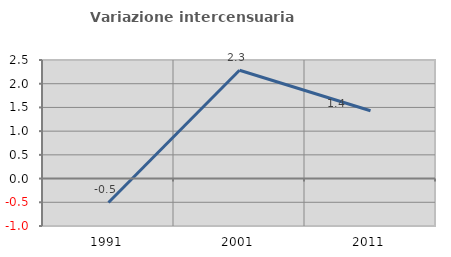
| Category | Variazione intercensuaria annua |
|---|---|
| 1991.0 | -0.504 |
| 2001.0 | 2.283 |
| 2011.0 | 1.431 |